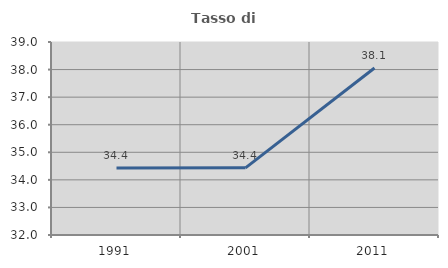
| Category | Tasso di occupazione   |
|---|---|
| 1991.0 | 34.428 |
| 2001.0 | 34.435 |
| 2011.0 | 38.057 |